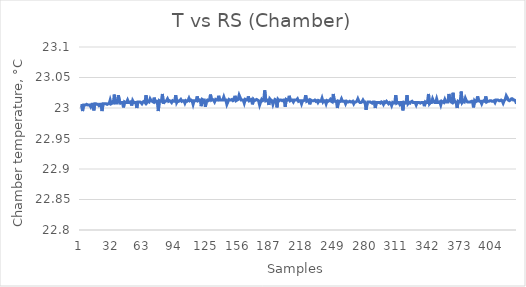
| Category | TRS |
|---|---|
| 0 | 23.004 |
| 1 | 23.004 |
| 2 | 22.995 |
| 3 | 23.005 |
| 4 | 23.005 |
| 5 | 23.005 |
| 6 | 23.006 |
| 7 | 23.005 |
| 8 | 23.005 |
| 9 | 23.005 |
| 10 | 23.002 |
| 11 | 23.006 |
| 12 | 23.006 |
| 13 | 22.996 |
| 14 | 23.007 |
| 15 | 23.007 |
| 16 | 23.006 |
| 17 | 23.006 |
| 18 | 23.004 |
| 19 | 23.006 |
| 20 | 23.006 |
| 21 | 22.995 |
| 22 | 23.007 |
| 23 | 23.007 |
| 24 | 23.007 |
| 25 | 23.007 |
| 26 | 23.006 |
| 27 | 23.007 |
| 28 | 23.007 |
| 29 | 23.013 |
| 30 | 23.007 |
| 31 | 23.008 |
| 32 | 23.008 |
| 33 | 23.022 |
| 34 | 23.008 |
| 35 | 23.008 |
| 36 | 23.008 |
| 37 | 23.021 |
| 38 | 23.012 |
| 39 | 23.008 |
| 40 | 23.009 |
| 41 | 23.009 |
| 42 | 23.001 |
| 43 | 23.01 |
| 44 | 23.009 |
| 45 | 23.009 |
| 46 | 23.013 |
| 47 | 23.009 |
| 48 | 23.009 |
| 49 | 23.01 |
| 50 | 23.004 |
| 51 | 23.012 |
| 52 | 23.009 |
| 53 | 23.009 |
| 54 | 23.009 |
| 55 | 23 |
| 56 | 23.01 |
| 57 | 23.01 |
| 58 | 23.01 |
| 59 | 23.009 |
| 60 | 23.007 |
| 61 | 23.01 |
| 62 | 23.011 |
| 63 | 23.009 |
| 64 | 23.021 |
| 65 | 23.009 |
| 66 | 23.011 |
| 67 | 23.01 |
| 68 | 23.015 |
| 69 | 23.012 |
| 70 | 23.011 |
| 71 | 23.01 |
| 72 | 23.017 |
| 73 | 23.01 |
| 74 | 23.011 |
| 75 | 23.011 |
| 76 | 22.995 |
| 77 | 23.012 |
| 78 | 23.011 |
| 79 | 23.011 |
| 80 | 23.023 |
| 81 | 23.007 |
| 82 | 23.011 |
| 83 | 23.011 |
| 84 | 23.012 |
| 85 | 23.015 |
| 86 | 23.011 |
| 87 | 23.012 |
| 88 | 23.011 |
| 89 | 23.009 |
| 90 | 23.012 |
| 91 | 23.011 |
| 92 | 23.011 |
| 93 | 23.021 |
| 94 | 23.009 |
| 95 | 23.012 |
| 96 | 23.011 |
| 97 | 23.012 |
| 98 | 23.014 |
| 99 | 23.011 |
| 100 | 23.012 |
| 101 | 23.012 |
| 102 | 23.008 |
| 103 | 23.012 |
| 104 | 23.011 |
| 105 | 23.012 |
| 106 | 23.016 |
| 107 | 23.012 |
| 108 | 23.013 |
| 109 | 23.012 |
| 110 | 23.006 |
| 111 | 23.012 |
| 112 | 23.012 |
| 113 | 23.012 |
| 114 | 23.019 |
| 115 | 23.012 |
| 116 | 23.013 |
| 117 | 23.013 |
| 118 | 23.003 |
| 119 | 23.014 |
| 120 | 23.013 |
| 121 | 23.013 |
| 122 | 23.002 |
| 123 | 23.011 |
| 124 | 23.013 |
| 125 | 23.012 |
| 126 | 23.013 |
| 127 | 23.022 |
| 128 | 23.013 |
| 129 | 23.014 |
| 130 | 23.013 |
| 131 | 23.01 |
| 132 | 23.014 |
| 133 | 23.013 |
| 134 | 23.013 |
| 135 | 23.02 |
| 136 | 23.013 |
| 137 | 23.013 |
| 138 | 23.013 |
| 139 | 23.013 |
| 140 | 23.018 |
| 141 | 23.013 |
| 142 | 23.013 |
| 143 | 23.006 |
| 144 | 23.01 |
| 145 | 23.014 |
| 146 | 23.013 |
| 147 | 23.013 |
| 148 | 23.014 |
| 149 | 23.012 |
| 150 | 23.013 |
| 151 | 23.02 |
| 152 | 23.012 |
| 153 | 23.013 |
| 154 | 23.014 |
| 155 | 23.021 |
| 156 | 23.017 |
| 157 | 23.013 |
| 158 | 23.013 |
| 159 | 23.013 |
| 160 | 23.008 |
| 161 | 23.014 |
| 162 | 23.013 |
| 163 | 23.013 |
| 164 | 23.019 |
| 165 | 23.012 |
| 166 | 23.013 |
| 167 | 23.014 |
| 168 | 23.006 |
| 169 | 23.014 |
| 170 | 23.012 |
| 171 | 23.013 |
| 172 | 23.014 |
| 173 | 23.013 |
| 174 | 23.012 |
| 175 | 23.005 |
| 176 | 23.01 |
| 177 | 23.014 |
| 178 | 23.012 |
| 179 | 23.013 |
| 180 | 23.029 |
| 181 | 23.012 |
| 182 | 23.013 |
| 183 | 23.013 |
| 184 | 23.005 |
| 185 | 23.015 |
| 186 | 23.013 |
| 187 | 23.012 |
| 188 | 23.006 |
| 189 | 23.011 |
| 190 | 23.014 |
| 191 | 23.013 |
| 192 | 23.001 |
| 193 | 23.014 |
| 194 | 23.012 |
| 195 | 23.013 |
| 196 | 23.013 |
| 197 | 23.012 |
| 198 | 23.013 |
| 199 | 23.013 |
| 200 | 23.002 |
| 201 | 23.014 |
| 202 | 23.013 |
| 203 | 23.013 |
| 204 | 23.02 |
| 205 | 23.012 |
| 206 | 23.013 |
| 207 | 23.013 |
| 208 | 23.01 |
| 209 | 23.013 |
| 210 | 23.013 |
| 211 | 23.013 |
| 212 | 23.015 |
| 213 | 23.011 |
| 214 | 23.012 |
| 215 | 23.012 |
| 216 | 23.007 |
| 217 | 23.012 |
| 218 | 23.012 |
| 219 | 23.013 |
| 220 | 23.021 |
| 221 | 23.011 |
| 222 | 23.012 |
| 223 | 23.013 |
| 224 | 23.006 |
| 225 | 23.013 |
| 226 | 23.012 |
| 227 | 23.012 |
| 228 | 23.012 |
| 229 | 23.013 |
| 230 | 23.011 |
| 231 | 23.012 |
| 232 | 23.009 |
| 233 | 23.012 |
| 234 | 23.011 |
| 235 | 23.011 |
| 236 | 23.016 |
| 237 | 23.01 |
| 238 | 23.012 |
| 239 | 23.012 |
| 240 | 23.007 |
| 241 | 23.012 |
| 242 | 23.011 |
| 243 | 23.012 |
| 244 | 23.014 |
| 245 | 23.011 |
| 246 | 23.01 |
| 247 | 23.023 |
| 248 | 23.011 |
| 249 | 23.011 |
| 250 | 23.011 |
| 251 | 23 |
| 252 | 23.011 |
| 253 | 23.01 |
| 254 | 23.011 |
| 255 | 23.015 |
| 256 | 23.011 |
| 257 | 23.011 |
| 258 | 23.011 |
| 259 | 23.007 |
| 260 | 23.011 |
| 261 | 23.01 |
| 262 | 23.01 |
| 263 | 23.011 |
| 264 | 23.01 |
| 265 | 23.01 |
| 266 | 23.011 |
| 267 | 23.007 |
| 268 | 23.01 |
| 269 | 23.01 |
| 270 | 23.011 |
| 271 | 23.015 |
| 272 | 23.011 |
| 273 | 23.009 |
| 274 | 23.009 |
| 275 | 23.01 |
| 276 | 23.013 |
| 277 | 23.01 |
| 278 | 23.01 |
| 279 | 22.997 |
| 280 | 23.007 |
| 281 | 23.01 |
| 282 | 23.01 |
| 283 | 23.01 |
| 284 | 23.009 |
| 285 | 23.008 |
| 286 | 23.01 |
| 287 | 23.01 |
| 288 | 23 |
| 289 | 23.009 |
| 290 | 23.009 |
| 291 | 23.009 |
| 292 | 23.009 |
| 293 | 23.008 |
| 294 | 23.01 |
| 295 | 23.009 |
| 296 | 23.006 |
| 297 | 23.01 |
| 298 | 23.009 |
| 299 | 23.011 |
| 300 | 23.009 |
| 301 | 23.007 |
| 302 | 23.009 |
| 303 | 23.008 |
| 304 | 23.004 |
| 305 | 23.009 |
| 306 | 23.008 |
| 307 | 23.008 |
| 308 | 23.021 |
| 309 | 23.008 |
| 310 | 23.009 |
| 311 | 23.009 |
| 312 | 23.006 |
| 313 | 23.009 |
| 314 | 23.009 |
| 315 | 22.996 |
| 316 | 23.009 |
| 317 | 23.008 |
| 318 | 23.008 |
| 319 | 23.021 |
| 320 | 23.007 |
| 321 | 23.009 |
| 322 | 23.008 |
| 323 | 23.01 |
| 324 | 23.011 |
| 325 | 23.009 |
| 326 | 23.009 |
| 327 | 23.009 |
| 328 | 23.005 |
| 329 | 23.009 |
| 330 | 23.009 |
| 331 | 23.009 |
| 332 | 23.008 |
| 333 | 23.009 |
| 334 | 23.009 |
| 335 | 23.009 |
| 336 | 23.003 |
| 337 | 23.01 |
| 338 | 23.009 |
| 339 | 23.009 |
| 340 | 23.023 |
| 341 | 23.007 |
| 342 | 23.009 |
| 343 | 23.009 |
| 344 | 23.015 |
| 345 | 23.011 |
| 346 | 23.009 |
| 347 | 23.009 |
| 348 | 23.015 |
| 349 | 23.009 |
| 350 | 23.009 |
| 351 | 23.01 |
| 352 | 23.005 |
| 353 | 23.011 |
| 354 | 23.01 |
| 355 | 23.009 |
| 356 | 23.014 |
| 357 | 23.01 |
| 358 | 23.01 |
| 359 | 23.01 |
| 360 | 23.023 |
| 361 | 23.012 |
| 362 | 23.01 |
| 363 | 23.009 |
| 364 | 23.025 |
| 365 | 23.01 |
| 366 | 23.011 |
| 367 | 23.009 |
| 368 | 23 |
| 369 | 23.011 |
| 370 | 23.01 |
| 371 | 23.01 |
| 372 | 23.027 |
| 373 | 23.009 |
| 374 | 23.011 |
| 375 | 23.01 |
| 376 | 23.016 |
| 377 | 23.012 |
| 378 | 23.01 |
| 379 | 23.01 |
| 380 | 23.01 |
| 381 | 23.01 |
| 382 | 23.011 |
| 383 | 23.011 |
| 384 | 23.001 |
| 385 | 23.012 |
| 386 | 23.01 |
| 387 | 23.011 |
| 388 | 23.019 |
| 389 | 23.012 |
| 390 | 23.011 |
| 391 | 23.011 |
| 392 | 23.007 |
| 393 | 23.011 |
| 394 | 23.012 |
| 395 | 23.011 |
| 396 | 23.019 |
| 397 | 23.01 |
| 398 | 23.011 |
| 399 | 23.011 |
| 400 | 23.012 |
| 401 | 23.012 |
| 402 | 23.011 |
| 403 | 23.011 |
| 404 | 23.012 |
| 405 | 23.009 |
| 406 | 23.013 |
| 407 | 23.013 |
| 408 | 23.013 |
| 409 | 23.012 |
| 410 | 23.012 |
| 411 | 23.013 |
| 412 | 23.012 |
| 413 | 23.008 |
| 414 | 23.012 |
| 415 | 23.014 |
| 416 | 23.02 |
| 417 | 23.017 |
| 418 | 23.013 |
| 419 | 23.012 |
| 420 | 23.013 |
| 421 | 23.015 |
| 422 | 23.015 |
| 423 | 23.013 |
| 424 | 23.013 |
| 425 | 23.012 |
| 426 | 23.007 |